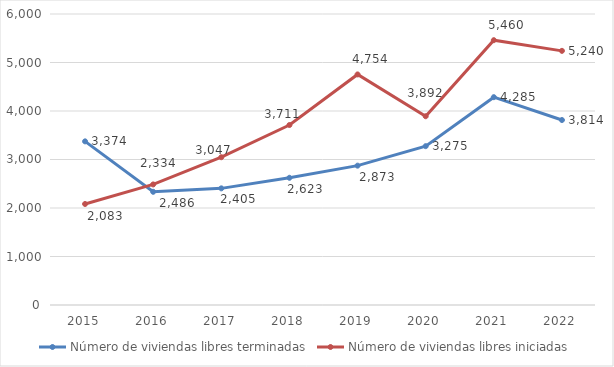
| Category | Número de viviendas libres terminadas | Número de viviendas libres iniciadas |
|---|---|---|
| 2015.0 | 3374 | 2083 |
| 2016.0 | 2334 | 2486 |
| 2017.0 | 2405 | 3047 |
| 2018.0 | 2623 | 3711 |
| 2019.0 | 2873 | 4754 |
| 2020.0 | 3275 | 3892 |
| 2021.0 | 4285 | 5460 |
| 2022.0 | 3814 | 5240 |